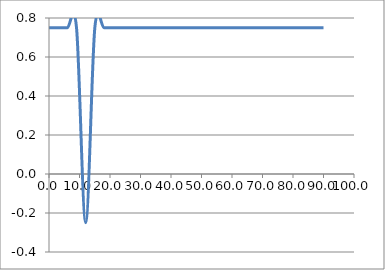
| Category | Elevation (in.) |
|---|---|
| 0.024 | 0.75 |
| 3.024 | 0.75 |
| 6.024 | 0.75 |
| 9.024000000000001 | 0.75 |
| 12.024000000000001 | -0.25 |
| 15.024000000000001 | 0.75 |
| 18.024 | 0.75 |
| 21.024 | 0.75 |
| 24.023999999999997 | 0.75 |
| 27.023999999999997 | 0.75 |
| 30.023999999999997 | 0.75 |
| 33.024 | 0.75 |
| 36.024 | 0.75 |
| 39.024 | 0.75 |
| 42.024 | 0.75 |
| 45.024 | 0.75 |
| 48.024 | 0.75 |
| 51.024 | 0.75 |
| 54.024 | 0.75 |
| 57.024 | 0.75 |
| 60.024 | 0.75 |
| 63.024 | 0.75 |
| 66.024 | 0.75 |
| 69.024 | 0.75 |
| 72.024 | 0.75 |
| 75.024 | 0.75 |
| 78.024 | 0.75 |
| 81.024 | 0.75 |
| 84.024 | 0.75 |
| 87.024 | 0.75 |
| 90.024 | 0.75 |